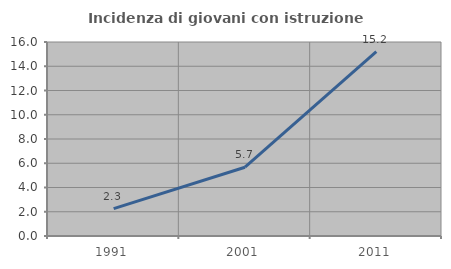
| Category | Incidenza di giovani con istruzione universitaria |
|---|---|
| 1991.0 | 2.256 |
| 2001.0 | 5.674 |
| 2011.0 | 15.2 |